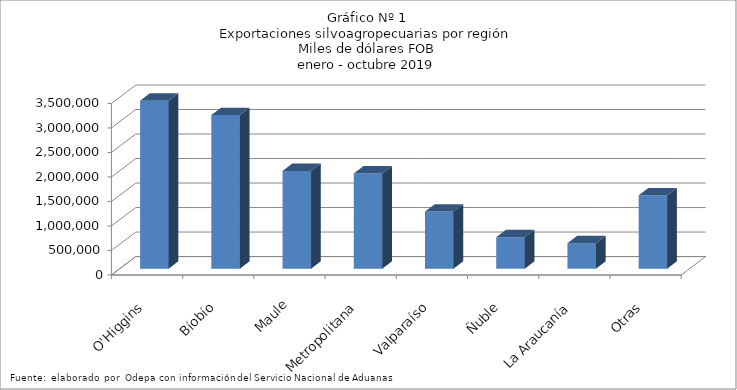
| Category | Series 0 |
|---|---|
| O'Higgins | 3428215.475 |
| Bíobío | 3134929.305 |
| Maule | 1994000.602 |
| Metropolitana | 1944174.163 |
| Valparaíso | 1165398.29 |
| Ñuble | 642082.564 |
| La Araucanía | 519982.631 |
| Otras | 1495996.594 |